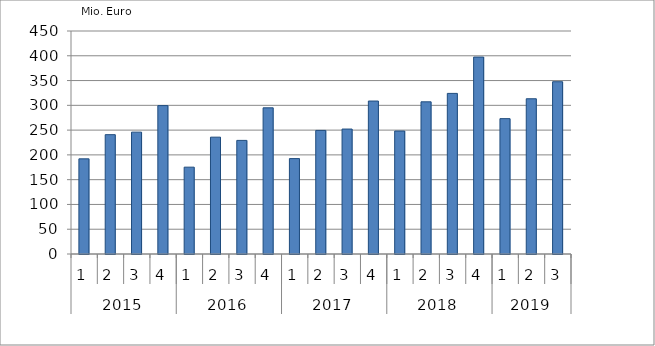
| Category | Ausbaugewerblicher Umsatz3 |
|---|---|
| 0 | 192043.756 |
| 1 | 240826.879 |
| 2 | 245916.087 |
| 3 | 299455.378 |
| 4 | 175225.59 |
| 5 | 235781.631 |
| 6 | 229227.559 |
| 7 | 294992.157 |
| 8 | 192499.539 |
| 9 | 249394.388 |
| 10 | 252146.755 |
| 11 | 308653.153 |
| 12 | 248133.418 |
| 13 | 307099.899 |
| 14 | 324088.989 |
| 15 | 397377.201 |
| 16 | 273159.137 |
| 17 | 313254.251 |
| 18 | 347631.281 |